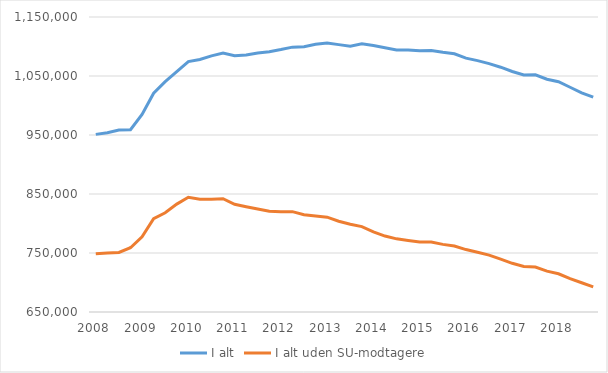
| Category | I alt | I alt uden SU-modtagere |
|---|---|---|
| 2008.0 | 951070 | 748600 |
| nan | 953928 | 749984 |
| nan | 958284 | 750927 |
| nan | 959001 | 758942 |
| 2009.0 | 984913 | 777353 |
| nan | 1020919 | 808104 |
| nan | 1040491 | 818245 |
| nan | 1057330 | 832884 |
| 2010.0 | 1074435 | 844360 |
| nan | 1077957 | 841178 |
| nan | 1084161 | 841147 |
| nan | 1088931 | 842002 |
| 2011.0 | 1084208 | 832630 |
| nan | 1085467 | 828445 |
| nan | 1089067 | 824672 |
| nan | 1091063 | 820808 |
| 2012.0 | 1094774 | 819783 |
| nan | 1098937 | 820055 |
| nan | 1099594 | 814987 |
| nan | 1103659 | 812761 |
| 2013.0 | 1106068 | 810703 |
| nan | 1103178 | 803914 |
| nan | 1100633 | 798783 |
| nan | 1104540 | 794725 |
| 2014.0 | 1101546 | 785885 |
| nan | 1097783 | 778692 |
| nan | 1094019 | 773994 |
| nan | 1094180 | 771299 |
| 2015.0 | 1092618 | 768605 |
| nan | 1093203 | 768513 |
| nan | 1090135 | 764602 |
| nan | 1087668 | 761849 |
| 2016.0 | 1080314 | 755828 |
| nan | 1076067 | 751233 |
| nan | 1071001 | 746372 |
| nan | 1064902 | 739661 |
| 2017.0 | 1057585 | 732553 |
| nan | 1051777 | 727126 |
| nan | 1052134 | 726228 |
| nan | 1044576 | 719307 |
| 2018.0 | 1040271 | 714812 |
| nan | 1030943 | 706431 |
| nan | 1021437 | 699536 |
| nan | 1014115 | 692701 |